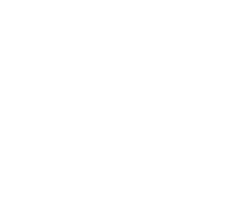
| Category | Series 2 | Series 1 |
|---|---|---|
| 0 | 0 | 0 |
| 1 | 0 | 0 |
| 2 | 0 | 0 |
| 3 | 0 | 0 |
| 4 | 0 | 0 |
| 5 | 0 | 0 |
| 6 | 0 | 0 |
| 7 | 0 | 0 |
| 8 | 0 | 0 |
| 9 | 0 | 0 |